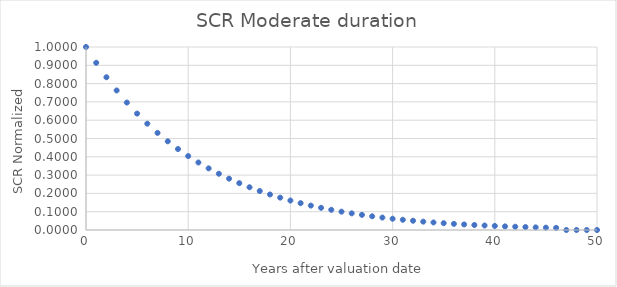
| Category | SCR Norm |
|---|---|
| 0.0 | 1 |
| 1.0 | 0.914 |
| 2.0 | 0.835 |
| 3.0 | 0.763 |
| 4.0 | 0.697 |
| 5.0 | 0.636 |
| 6.0 | 0.581 |
| 7.0 | 0.531 |
| 8.0 | 0.485 |
| 9.0 | 0.442 |
| 10.0 | 0.404 |
| 11.0 | 0.369 |
| 12.0 | 0.337 |
| 13.0 | 0.307 |
| 14.0 | 0.281 |
| 15.0 | 0.256 |
| 16.0 | 0.234 |
| 17.0 | 0.213 |
| 18.0 | 0.194 |
| 19.0 | 0.177 |
| 20.0 | 0.161 |
| 21.0 | 0.147 |
| 22.0 | 0.133 |
| 23.0 | 0.121 |
| 24.0 | 0.11 |
| 25.0 | 0.1 |
| 26.0 | 0.091 |
| 27.0 | 0.083 |
| 28.0 | 0.075 |
| 29.0 | 0.068 |
| 30.0 | 0.062 |
| 31.0 | 0.056 |
| 32.0 | 0.051 |
| 33.0 | 0.046 |
| 34.0 | 0.041 |
| 35.0 | 0.037 |
| 36.0 | 0.034 |
| 37.0 | 0.03 |
| 38.0 | 0.027 |
| 39.0 | 0.025 |
| 40.0 | 0.022 |
| 41.0 | 0.02 |
| 42.0 | 0.018 |
| 43.0 | 0.016 |
| 44.0 | 0.014 |
| 45.0 | 0.013 |
| 46.0 | 0.012 |
| 47.0 | 0 |
| 48.0 | 0 |
| 49.0 | 0 |
| 50.0 | 0 |
| 51.0 | 0 |
| 52.0 | 0 |
| 53.0 | 0 |
| 54.0 | 0 |
| 55.0 | 0 |
| 56.0 | 0 |
| 57.0 | 0 |
| 58.0 | 0 |
| 59.0 | 0 |
| 60.0 | 0 |
| 61.0 | 0 |
| 62.0 | 0 |
| 63.0 | 0 |
| 64.0 | 0 |
| 65.0 | 0 |
| 66.0 | 0 |
| 67.0 | 0 |
| 68.0 | 0 |
| 69.0 | 0 |
| 70.0 | 0 |
| 71.0 | 0 |
| 72.0 | 0 |
| 73.0 | 0 |
| 74.0 | 0 |
| 75.0 | 0 |
| 76.0 | 0 |
| 77.0 | 0 |
| 78.0 | 0 |
| 79.0 | 0 |
| 80.0 | 0 |